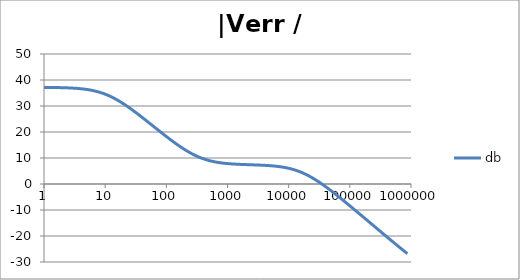
| Category | db |
|---|---|
| 1.0 | 37.149 |
| 1.0715193052376064 | 37.143 |
| 1.1481536214968828 | 37.137 |
| 1.2302687708123814 | 37.13 |
| 1.318256738556407 | 37.122 |
| 1.4125375446227544 | 37.113 |
| 1.513561248436208 | 37.102 |
| 1.6218100973589298 | 37.09 |
| 1.7378008287493754 | 37.077 |
| 1.8620871366628673 | 37.061 |
| 1.9952623149688797 | 37.043 |
| 2.1379620895022318 | 37.022 |
| 2.2908676527677727 | 36.998 |
| 2.45470891568503 | 36.971 |
| 2.6302679918953817 | 36.941 |
| 2.8183829312644537 | 36.906 |
| 3.0199517204020156 | 36.866 |
| 3.235936569296282 | 36.82 |
| 3.467368504525316 | 36.769 |
| 3.7153522909717256 | 36.71 |
| 3.9810717055349727 | 36.644 |
| 4.265795188015926 | 36.57 |
| 4.570881896148749 | 36.486 |
| 4.897788193684462 | 36.391 |
| 5.2480746024977245 | 36.285 |
| 5.62341325190349 | 36.166 |
| 6.025595860743575 | 36.034 |
| 6.456542290346554 | 35.886 |
| 6.918309709189363 | 35.723 |
| 7.4131024130091765 | 35.543 |
| 7.943282347242814 | 35.345 |
| 8.511380382023765 | 35.129 |
| 9.120108393559095 | 34.893 |
| 9.772372209558105 | 34.637 |
| 10.47128548050899 | 34.361 |
| 11.22018454301963 | 34.064 |
| 12.022644346174127 | 33.746 |
| 12.88249551693134 | 33.408 |
| 13.803842646028851 | 33.05 |
| 14.791083881682074 | 32.673 |
| 15.848931924611136 | 32.277 |
| 16.98243652461744 | 31.863 |
| 18.197008586099834 | 31.431 |
| 19.498445997580447 | 30.984 |
| 20.892961308540382 | 30.523 |
| 22.387211385683386 | 30.047 |
| 23.988329190194897 | 29.559 |
| 25.703957827688622 | 29.06 |
| 27.54228703338165 | 28.55 |
| 29.51209226666385 | 28.031 |
| 31.62277660168379 | 27.504 |
| 33.884415613920254 | 26.97 |
| 36.307805477010106 | 26.43 |
| 38.90451449942804 | 25.884 |
| 41.686938347033525 | 25.334 |
| 44.6683592150963 | 24.78 |
| 47.86300923226381 | 24.222 |
| 51.28613839913647 | 23.663 |
| 54.95408738576247 | 23.102 |
| 58.88436553555889 | 22.54 |
| 63.09573444801931 | 21.978 |
| 67.60829753919813 | 21.416 |
| 72.44359600749901 | 20.855 |
| 77.62471166286915 | 20.296 |
| 83.17637711026705 | 19.739 |
| 89.12509381337456 | 19.185 |
| 95.49925860214357 | 18.635 |
| 102.32929922807544 | 18.09 |
| 109.64781961431841 | 17.55 |
| 117.48975549395293 | 17.017 |
| 125.89254117941665 | 16.491 |
| 134.89628825916537 | 15.973 |
| 144.54397707459273 | 15.465 |
| 154.88166189124806 | 14.967 |
| 165.95869074375608 | 14.48 |
| 177.82794100389225 | 14.007 |
| 190.5460717963248 | 13.547 |
| 204.17379446695278 | 13.101 |
| 218.77616239495524 | 12.672 |
| 234.42288153199212 | 12.26 |
| 251.18864315095806 | 11.866 |
| 269.15348039269156 | 11.491 |
| 288.4031503126605 | 11.136 |
| 309.0295432513591 | 10.8 |
| 331.1311214825911 | 10.485 |
| 354.81338923357566 | 10.19 |
| 380.18939632056095 | 9.916 |
| 407.3802778041123 | 9.663 |
| 436.5158322401654 | 9.429 |
| 467.7351412871979 | 9.214 |
| 501.18723362727184 | 9.018 |
| 537.0317963702526 | 8.84 |
| 575.4399373371566 | 8.678 |
| 616.5950018614822 | 8.532 |
| 660.6934480075952 | 8.401 |
| 707.9457843841375 | 8.282 |
| 758.5775750291831 | 8.177 |
| 812.8305161640983 | 8.082 |
| 870.9635899560801 | 7.998 |
| 933.2543007969903 | 7.922 |
| 999.9999999999998 | 7.855 |
| 1071.5193052376057 | 7.795 |
| 1148.1536214968828 | 7.742 |
| 1230.2687708123801 | 7.694 |
| 1318.2567385564053 | 7.651 |
| 1412.537544622753 | 7.613 |
| 1513.5612484362066 | 7.578 |
| 1621.8100973589292 | 7.546 |
| 1737.8008287493742 | 7.516 |
| 1862.0871366628671 | 7.489 |
| 1995.2623149688786 | 7.463 |
| 2137.9620895022326 | 7.438 |
| 2290.867652767771 | 7.414 |
| 2454.708915685027 | 7.39 |
| 2630.26799189538 | 7.365 |
| 2818.382931264451 | 7.34 |
| 3019.9517204020176 | 7.314 |
| 3235.9365692962774 | 7.286 |
| 3467.368504525316 | 7.256 |
| 3715.352290971724 | 7.224 |
| 3981.07170553497 | 7.188 |
| 4265.795188015923 | 7.148 |
| 4570.881896148745 | 7.105 |
| 4897.788193684463 | 7.056 |
| 5248.074602497726 | 7.001 |
| 5623.413251903489 | 6.939 |
| 6025.595860743574 | 6.87 |
| 6456.54229034655 | 6.793 |
| 6918.309709189357 | 6.706 |
| 7413.102413009165 | 6.609 |
| 7943.282347242815 | 6.501 |
| 8511.380382023763 | 6.38 |
| 9120.108393559092 | 6.245 |
| 9772.3722095581 | 6.095 |
| 10471.285480509003 | 5.929 |
| 11220.184543019639 | 5.747 |
| 12022.64434617411 | 5.547 |
| 12882.495516931338 | 5.327 |
| 13803.842646028841 | 5.089 |
| 14791.083881682063 | 4.83 |
| 15848.931924611119 | 4.551 |
| 16982.436524617453 | 4.251 |
| 18197.008586099837 | 3.931 |
| 19498.445997580417 | 3.59 |
| 20892.961308540387 | 3.229 |
| 22387.211385683382 | 2.849 |
| 23988.32919019488 | 2.45 |
| 25703.957827688606 | 2.032 |
| 27542.28703338167 | 1.598 |
| 29512.092266663854 | 1.148 |
| 31622.77660168378 | 0.682 |
| 33884.41561392023 | 0.203 |
| 36307.805477010166 | -0.289 |
| 38904.514499428085 | -0.792 |
| 41686.93834703348 | -1.306 |
| 44668.35921509631 | -1.83 |
| 47863.00923226382 | -2.363 |
| 51286.13839913646 | -2.903 |
| 54954.08738576241 | -3.451 |
| 58884.365535558936 | -4.004 |
| 63095.73444801934 | -4.563 |
| 67608.29753919817 | -5.127 |
| 72443.59600749899 | -5.696 |
| 77624.71166286913 | -6.268 |
| 83176.37711026703 | -6.843 |
| 89125.09381337445 | -7.422 |
| 95499.25860214363 | -8.003 |
| 102329.29922807543 | -8.586 |
| 109647.81961431848 | -9.171 |
| 117489.75549395289 | -9.758 |
| 125892.54117941685 | -10.347 |
| 134896.28825916522 | -10.936 |
| 144543.97707459255 | -11.527 |
| 154881.66189124787 | -12.118 |
| 165958.69074375575 | -12.711 |
| 177827.9410038922 | -13.303 |
| 190546.07179632425 | -13.897 |
| 204173.79446695274 | -14.49 |
| 218776.16239495497 | -15.084 |
| 234422.88153199226 | -15.678 |
| 251188.64315095753 | -16.272 |
| 269153.480392691 | -16.865 |
| 288403.15031266044 | -17.459 |
| 309029.5432513582 | -18.052 |
| 331131.1214825907 | -18.644 |
| 354813.3892335749 | -19.236 |
| 380189.3963205612 | -19.827 |
| 407380.2778041119 | -20.417 |
| 436515.8322401649 | -21.005 |
| 467735.14128719777 | -21.593 |
| 501187.2336272717 | -22.179 |
| 537031.7963702519 | -22.762 |
| 575439.9373371559 | -23.344 |
| 616595.001861482 | -23.923 |
| 660693.4480075944 | -24.5 |
| 707945.7843841374 | -25.073 |
| 758577.575029183 | -25.643 |
| 812830.5161640996 | -26.208 |
| 870963.5899560791 | -26.769 |